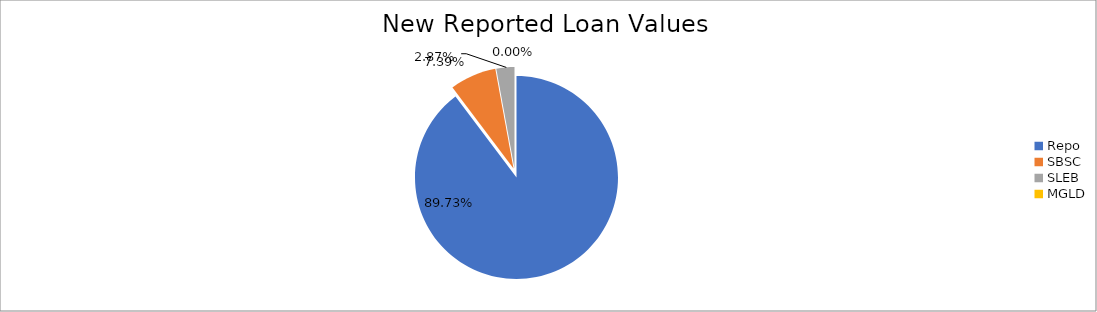
| Category | Series 0 |
|---|---|
| Repo | 11343079.454 |
| SBSC | 934591.062 |
| SLEB | 363035.844 |
| MGLD | 321.994 |